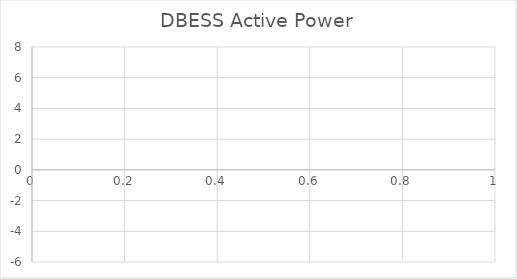
| Category | DBESS Active Power |
|---|---|
| 0 | 0.131 |
| 1 | 0.125 |
| 2 | 0.134 |
| 3 | 0.147 |
| 4 | 0.089 |
| 5 | 0.093 |
| 6 | 0.148 |
| 7 | 0.148 |
| 8 | 0.113 |
| 9 | 0.113 |
| 10 | 0.11 |
| 11 | 0.14 |
| 12 | 0.15 |
| 13 | 0.141 |
| 14 | 0.13 |
| 15 | 0.103 |
| 16 | 0.093 |
| 17 | 0.128 |
| 18 | 0.109 |
| 19 | 0.092 |
| 20 | 0.085 |
| 21 | 0.092 |
| 22 | 0.057 |
| 23 | 0.077 |
| 24 | 0.111 |
| 25 | 0.105 |
| 26 | 0.133 |
| 27 | 0.133 |
| 28 | 0.116 |
| 29 | 0.103 |
| 30 | 0.094 |
| 31 | 0.094 |
| 32 | 0.128 |
| 33 | 0.13 |
| 34 | 0.127 |
| 35 | 0.116 |
| 36 | 0.116 |
| 37 | 0.172 |
| 38 | 0.172 |
| 39 | 0.1 |
| 40 | 0.082 |
| 41 | 0.082 |
| 42 | 0.13 |
| 43 | 0.11 |
| 44 | 0.098 |
| 45 | 0.071 |
| 46 | 0.045 |
| 47 | 0.069 |
| 48 | 0.069 |
| 49 | 0.058 |
| 50 | 0.056 |
| 51 | 0.08 |
| 52 | 0.1 |
| 53 | 0.08 |
| 54 | 0.066 |
| 55 | 0.059 |
| 56 | 0.043 |
| 57 | 0.043 |
| 58 | 0.043 |
| 59 | 0.046 |
| 60 | 0.046 |
| 61 | 0.044 |
| 62 | 0.023 |
| 63 | 0.022 |
| 64 | 0.02 |
| 65 | 0.05 |
| 66 | 0.041 |
| 67 | 0.039 |
| 68 | 0.056 |
| 69 | 0.066 |
| 70 | 0.1 |
| 71 | 0.104 |
| 72 | 0.073 |
| 73 | 0.048 |
| 74 | 0.022 |
| 75 | 0.014 |
| 76 | 0.057 |
| 77 | 0.062 |
| 78 | 0.065 |
| 79 | 0.068 |
| 80 | 0.068 |
| 81 | 0.035 |
| 82 | 0.041 |
| 83 | 0.061 |
| 84 | 0.04 |
| 85 | 0.065 |
| 86 | 0.065 |
| 87 | 0.086 |
| 88 | 0.128 |
| 89 | 0.033 |
| 90 | 0.001 |
| 91 | 0 |
| 92 | 0.011 |
| 93 | 0.045 |
| 94 | 0.036 |
| 95 | 0.01 |
| 96 | 0.01 |
| 97 | -0.009 |
| 98 | -0.006 |
| 99 | 0.027 |
| 100 | 0.028 |
| 101 | 0.048 |
| 102 | 0.03 |
| 103 | -0.011 |
| 104 | 0.033 |
| 105 | 0.041 |
| 106 | 0.011 |
| 107 | 0.02 |
| 108 | 0.035 |
| 109 | 0.014 |
| 110 | 0.002 |
| 111 | -0.007 |
| 112 | 0.004 |
| 113 | 0.014 |
| 114 | 0.022 |
| 115 | 0.022 |
| 116 | 0.047 |
| 117 | 0.039 |
| 118 | 0 |
| 119 | 0.026 |
| 120 | 0.047 |
| 121 | 0.057 |
| 122 | 0.04 |
| 123 | 0.034 |
| 124 | 0.047 |
| 125 | 0.021 |
| 126 | 0.031 |
| 127 | 0.041 |
| 128 | 0.052 |
| 129 | 0.065 |
| 130 | 0.008 |
| 131 | 0.017 |
| 132 | 0.037 |
| 133 | 0.023 |
| 134 | -0.018 |
| 135 | -0.021 |
| 136 | 0.029 |
| 137 | 0.014 |
| 138 | 0.068 |
| 139 | 0.088 |
| 140 | -0.074 |
| 141 | -0.094 |
| 142 | 0.041 |
| 143 | 0.054 |
| 144 | 0.04 |
| 145 | 0.045 |
| 146 | 0.019 |
| 147 | -0.002 |
| 148 | 0.042 |
| 149 | 0.048 |
| 150 | 0.043 |
| 151 | 0.038 |
| 152 | 0.88 |
| 153 | 2.011 |
| 154 | 3.896 |
| 155 | 5.542 |
| 156 | 6.577 |
| 157 | 6.971 |
| 158 | 6.971 |
| 159 | 6.956 |
| 160 | 6.977 |
| 161 | 6.982 |
| 162 | 6.976 |
| 163 | 6.963 |
| 164 | 6.956 |
| 165 | 6.967 |
| 166 | 6.978 |
| 167 | 6.978 |
| 168 | 6.986 |
| 169 | 6.986 |
| 170 | 6.98 |
| 171 | 6.989 |
| 172 | 6.942 |
| 173 | 6.695 |
| 174 | 6.484 |
| 175 | 6.161 |
| 176 | 6.015 |
| 177 | 5.454 |
| 178 | 4.923 |
| 179 | 3.784 |
| 180 | 2.784 |
| 181 | 2.162 |
| 182 | 1.976 |
| 183 | 1.915 |
| 184 | 1.686 |
| 185 | 1.424 |
| 186 | 1.254 |
| 187 | 1.062 |
| 188 | 1.002 |
| 189 | 0.985 |
| 190 | 1.002 |
| 191 | 1 |
| 192 | 0.99 |
| 193 | 0.993 |
| 194 | 0.993 |
| 195 | 1 |
| 196 | 1.003 |
| 197 | 1.003 |
| 198 | 0.924 |
| 199 | 0.716 |
| 200 | 0.48 |
| 201 | 0.203 |
| 202 | 0.09 |
| 203 | 0.13 |
| 204 | 0.303 |
| 205 | 0.543 |
| 206 | 0.802 |
| 207 | 0.967 |
| 208 | 0.907 |
| 209 | 0.716 |
| 210 | 0.408 |
| 211 | 0.2 |
| 212 | 0.057 |
| 213 | 0.064 |
| 214 | 0.077 |
| 215 | 0.077 |
| 216 | 0.038 |
| 217 | 0.038 |
| 218 | 0.1 |
| 219 | 0.258 |
| 220 | 0.555 |
| 221 | 0.784 |
| 222 | 0.979 |
| 223 | 0.885 |
| 224 | 0.812 |
| 225 | 0.465 |
| 226 | 0.232 |
| 227 | 0.045 |
| 228 | 0.01 |
| 229 | 0.034 |
| 230 | 0.05 |
| 231 | 0.004 |
| 232 | -0.035 |
| 233 | 0.105 |
| 234 | 0.266 |
| 235 | 0.514 |
| 236 | 0.807 |
| 237 | 0.952 |
| 238 | 0.925 |
| 239 | 0.88 |
| 240 | 0.402 |
| 241 | 0.208 |
| 242 | 0.044 |
| 243 | 0.026 |
| 244 | 0.224 |
| 245 | 0.522 |
| 246 | 1.023 |
| 247 | 1.588 |
| 248 | 1.863 |
| 249 | 1.788 |
| 250 | 1.479 |
| 251 | 0.853 |
| 252 | 0.273 |
| 253 | 0.088 |
| 254 | 0.024 |
| 255 | 0.024 |
| 256 | 0.042 |
| 257 | 0.057 |
| 258 | 0.059 |
| 259 | 0.042 |
| 260 | 0.032 |
| 261 | 0.014 |
| 262 | 0.039 |
| 263 | 0.046 |
| 264 | -0.013 |
| 265 | -0.015 |
| 266 | 0.046 |
| 267 | 0.047 |
| 268 | 0.025 |
| 269 | 0.011 |
| 270 | 0.014 |
| 271 | 0.014 |
| 272 | -0.007 |
| 273 | 0.01 |
| 274 | 0.254 |
| 275 | 0.576 |
| 276 | 1.122 |
| 277 | 1.645 |
| 278 | 1.898 |
| 279 | 1.787 |
| 280 | 1.633 |
| 281 | 0.953 |
| 282 | 0.396 |
| 283 | 0.064 |
| 284 | 0.019 |
| 285 | 0.015 |
| 286 | 0.014 |
| 287 | 0.018 |
| 288 | 0.019 |
| 289 | 0.002 |
| 290 | -0.005 |
| 291 | 0.001 |
| 292 | 0.017 |
| 293 | 0.018 |
| 294 | 0.015 |
| 295 | 0.017 |
| 296 | 0.016 |
| 297 | 0.032 |
| 298 | 0.015 |
| 299 | 0.018 |
| 300 | 0.027 |
| 301 | -0.012 |
| 302 | 0.035 |
| 303 | 0.062 |
| 304 | 0.042 |
| 305 | 0.222 |
| 306 | 0.518 |
| 307 | 1.113 |
| 308 | 1.594 |
| 309 | 1.852 |
| 310 | 1.779 |
| 311 | 1.523 |
| 312 | 0.875 |
| 313 | 0.165 |
| 314 | 0.081 |
| 315 | 0.002 |
| 316 | 0.021 |
| 317 | 0.042 |
| 318 | 0.015 |
| 319 | 0.024 |
| 320 | -0.039 |
| 321 | 0.001 |
| 322 | -0.011 |
| 323 | 0.001 |
| 324 | 0.001 |
| 325 | 0.016 |
| 326 | 0.008 |
| 327 | 0.008 |
| 328 | 0.028 |
| 329 | 0.028 |
| 330 | 0.014 |
| 331 | 0.01 |
| 332 | 0.009 |
| 333 | 0.013 |
| 334 | 0.013 |
| 335 | 0.005 |
| 336 | 0.019 |
| 337 | -0.002 |
| 338 | -0.008 |
| 339 | -0.012 |
| 340 | -0.001 |
| 341 | 0.036 |
| 342 | 0.011 |
| 343 | -0.007 |
| 344 | 0.008 |
| 345 | 0.02 |
| 346 | 0.011 |
| 347 | 0.021 |
| 348 | 0.037 |
| 349 | 0.001 |
| 350 | 0.001 |
| 351 | 0.019 |
| 352 | 0.05 |
| 353 | 0.017 |
| 354 | -0.017 |
| 355 | 0.018 |
| 356 | 0.036 |
| 357 | 0.036 |
| 358 | 0.016 |
| 359 | 0.029 |
| 360 | 0.034 |
| 361 | 0.025 |
| 362 | 0.02 |
| 363 | 0.01 |
| 364 | 0.037 |
| 365 | 0.038 |
| 366 | 0.037 |
| 367 | 0.037 |
| 368 | 0.056 |
| 369 | 0.032 |
| 370 | 0.032 |
| 371 | -0.006 |
| 372 | 0.019 |
| 373 | 0.037 |
| 374 | 0.038 |
| 375 | 0.022 |
| 376 | 0.011 |
| 377 | 0.019 |
| 378 | 0.02 |
| 379 | 0.041 |
| 380 | 0.01 |
| 381 | 0.127 |
| 382 | 0.122 |
| 383 | 0.014 |
| 384 | 0.014 |
| 385 | 0.018 |
| 386 | 0.018 |
| 387 | 0.04 |
| 388 | 0.04 |
| 389 | -0.006 |
| 390 | -0.006 |
| 391 | 0.033 |
| 392 | 0.033 |
| 393 | 0.017 |
| 394 | 0.017 |
| 395 | 0.038 |
| 396 | 0.01 |
| 397 | -0.025 |
| 398 | 0.021 |
| 399 | 0.028 |
| 400 | 0.028 |
| 401 | -0.007 |
| 402 | -0.001 |
| 403 | -0.001 |
| 404 | 0.032 |
| 405 | 0.028 |
| 406 | 0.005 |
| 407 | 0.044 |
| 408 | 0.021 |
| 409 | 0.028 |
| 410 | 0.001 |
| 411 | -0.013 |
| 412 | 0.031 |
| 413 | 0.031 |
| 414 | 0.044 |
| 415 | 0.036 |
| 416 | 0.018 |
| 417 | 0.032 |
| 418 | 0.021 |
| 419 | 0.021 |
| 420 | 0.03 |
| 421 | 0.055 |
| 422 | 0.038 |
| 423 | 0.059 |
| 424 | 0.02 |
| 425 | 0.02 |
| 426 | 0.011 |
| 427 | 0.02 |
| 428 | 0.024 |
| 429 | -0.008 |
| 430 | -0.004 |
| 431 | 0.045 |
| 432 | 0.045 |
| 433 | 0.053 |
| 434 | 0.045 |
| 435 | 0.035 |
| 436 | 0.025 |
| 437 | 0.028 |
| 438 | 0.004 |
| 439 | -0.001 |
| 440 | 0.014 |
| 441 | 0.014 |
| 442 | -0.015 |
| 443 | -0.008 |
| 444 | 0.023 |
| 445 | 0.053 |
| 446 | 0.069 |
| 447 | 0.06 |
| 448 | 0.049 |
| 449 | 0.066 |
| 450 | 0.066 |
| 451 | 0.12 |
| 452 | 0.12 |
| 453 | 0.143 |
| 454 | 0.124 |
| 455 | 0.13 |
| 456 | 0.149 |
| 457 | 0.115 |
| 458 | 0.136 |
| 459 | 0.141 |
| 460 | 0.102 |
| 461 | 0.102 |
| 462 | 0.089 |
| 463 | 0.079 |
| 464 | 0.065 |
| 465 | 0.08 |
| 466 | 0.107 |
| 467 | 0.111 |
| 468 | 0.121 |
| 469 | 0.121 |
| 470 | 0.102 |
| 471 | 0.114 |
| 472 | 0.123 |
| 473 | 0.125 |
| 474 | 0.125 |
| 475 | 0.132 |
| 476 | 0.167 |
| 477 | 0.154 |
| 478 | 0.117 |
| 479 | 0.135 |
| 480 | 0.119 |
| 481 | 0.123 |
| 482 | 0.101 |
| 483 | 0.107 |
| 484 | 0.129 |
| 485 | 0.135 |
| 486 | 0.139 |
| 487 | 0.139 |
| 488 | 0.135 |
| 489 | 0.123 |
| 490 | 0.142 |
| 491 | 0.142 |
| 492 | 0.123 |
| 493 | 0.12 |
| 494 | 0.137 |
| 495 | 0.161 |
| 496 | 0.147 |
| 497 | 0.147 |
| 498 | 0.147 |
| 499 | 0.144 |
| 500 | -1.536 |
| 501 | -1.55 |
| 502 | -3.137 |
| 503 | -3.273 |
| 504 | -3.368 |
| 505 | -3.41 |
| 506 | -3.35 |
| 507 | -3.356 |
| 508 | -3.278 |
| 509 | -3.184 |
| 510 | -3.014 |
| 511 | -3.059 |
| 512 | -3.071 |
| 513 | -3.054 |
| 514 | -3.018 |
| 515 | -3.091 |
| 516 | -3.175 |
| 517 | -3.325 |
| 518 | -3.442 |
| 519 | -3.461 |
| 520 | -3.443 |
| 521 | -3.409 |
| 522 | -3.299 |
| 523 | -3.515 |
| 524 | -3.488 |
| 525 | -3.405 |
| 526 | -3.429 |
| 527 | -3.45 |
| 528 | -3.448 |
| 529 | -3.395 |
| 530 | -3.395 |
| 531 | -3.363 |
| 532 | -3.401 |
| 533 | -3.479 |
| 534 | -3.498 |
| 535 | -3.482 |
| 536 | -3.48 |
| 537 | -3.497 |
| 538 | -1.992 |
| 539 | -1.992 |
| 540 | -0.522 |
| 541 | -0.416 |
| 542 | -0.439 |
| 543 | -0.554 |
| 544 | -0.645 |
| 545 | -0.794 |
| 546 | -0.958 |
| 547 | -1.027 |
| 548 | -1.077 |
| 549 | -0.94 |
| 550 | -2.053 |
| 551 | -1.88 |
| 552 | -0.167 |
| 553 | 0.03 |
| 554 | 0.111 |
| 555 | 0.122 |
| 556 | 0.161 |
| 557 | 0.136 |
| 558 | 0.141 |
| 559 | 0.11 |
| 560 | 0.103 |
| 561 | 0.138 |
| 562 | 0.143 |
| 563 | 0.16 |
| 564 | 0.139 |
| 565 | 0.139 |
| 566 | 0.133 |
| 567 | 0.117 |
| 568 | 0.115 |
| 569 | 0.097 |
| 570 | -0.654 |
| 571 | -0.843 |
| 572 | -0.77 |
| 573 | -0.032 |
| 574 | 0.163 |
| 575 | 0.163 |
| 576 | 0.148 |
| 577 | 0.136 |
| 578 | 0.127 |
| 579 | 0.142 |
| 580 | 0.126 |
| 581 | 0.126 |
| 582 | 0.13 |
| 583 | 0.149 |
| 584 | 0.123 |
| 585 | 0.12 |
| 586 | 0.137 |
| 587 | 0.14 |
| 588 | 0.101 |
| 589 | 0.097 |
| 590 | 0.099 |
| 591 | 0.102 |
| 592 | 0.11 |
| 593 | 0.11 |
| 594 | 0.082 |
| 595 | 0.101 |
| 596 | 0.101 |
| 597 | 0.122 |
| 598 | 0.101 |
| 599 | 0.104 |
| 600 | 0.097 |
| 601 | 0.085 |
| 602 | 0.128 |
| 603 | 0.114 |
| 604 | 0.089 |
| 605 | 0.083 |
| 606 | 0.102 |
| 607 | 0.102 |
| 608 | 0.095 |
| 609 | 0.078 |
| 610 | 0.078 |
| 611 | 0.076 |
| 612 | 0.078 |
| 613 | 0.076 |
| 614 | 0.042 |
| 615 | 0.034 |
| 616 | 0.065 |
| 617 | 0.044 |
| 618 | 0.018 |
| 619 | 0.043 |
| 620 | 0.075 |
| 621 | 0.082 |
| 622 | 0.045 |
| 623 | 0.028 |
| 624 | 0.069 |
| 625 | 0.082 |
| 626 | 0.082 |
| 627 | 0.039 |
| 628 | 0.024 |
| 629 | 0.064 |
| 630 | 0.064 |
| 631 | 0.042 |
| 632 | 0.098 |
| 633 | 0.067 |
| 634 | 0.076 |
| 635 | 0.08 |
| 636 | 0.035 |
| 637 | 0.042 |
| 638 | 0.064 |
| 639 | 0.061 |
| 640 | 0.074 |
| 641 | 0.068 |
| 642 | 0.043 |
| 643 | 0.015 |
| 644 | 0.024 |
| 645 | 0.035 |
| 646 | 0.072 |
| 647 | 0.071 |
| 648 | 0.032 |
| 649 | 0.049 |
| 650 | 0.046 |
| 651 | 0.009 |
| 652 | 0.027 |
| 653 | 0.078 |
| 654 | 0.071 |
| 655 | 0.049 |
| 656 | 0.046 |
| 657 | 0.048 |
| 658 | 0.055 |
| 659 | 0.017 |
| 660 | 0.061 |
| 661 | 0.087 |
| 662 | 0.063 |
| 663 | 0.061 |
| 664 | 0.052 |
| 665 | 0 |
| 666 | 0.033 |
| 667 | 0.062 |
| 668 | 0.062 |
| 669 | 0.048 |
| 670 | 0.048 |
| 671 | 0.626 |
| 672 | 1.352 |
| 673 | 2.835 |
| 674 | 3.945 |
| 675 | 4.666 |
| 676 | 4.961 |
| 677 | 4.963 |
| 678 | 4.979 |
| 679 | 4.914 |
| 680 | 4.918 |
| 681 | 4.963 |
| 682 | 4.968 |
| 683 | 4.959 |
| 684 | 4.94 |
| 685 | 4.94 |
| 686 | 4.965 |
| 687 | 4.952 |
| 688 | 4.958 |
| 689 | 4.958 |
| 690 | 4.952 |
| 691 | 4.941 |
| 692 | 4.942 |
| 693 | 4.942 |
| 694 | 4.936 |
| 695 | 4.964 |
| 696 | 4.964 |
| 697 | 4.959 |
| 698 | 4.964 |
| 699 | 4.969 |
| 700 | 4.952 |
| 701 | 4.962 |
| 702 | 4.962 |
| 703 | 4.971 |
| 704 | 4.971 |
| 705 | 4.966 |
| 706 | 4.966 |
| 707 | 4.955 |
| 708 | 4.959 |
| 709 | 4.957 |
| 710 | 4.924 |
| 711 | 4.973 |
| 712 | 4.98 |
| 713 | 4.969 |
| 714 | 4.953 |
| 715 | 4.946 |
| 716 | 4.941 |
| 717 | 4.972 |
| 718 | 4.988 |
| 719 | 4.942 |
| 720 | 4.951 |
| 721 | 4.973 |
| 722 | 4.977 |
| 723 | 4.976 |
| 724 | 4.971 |
| 725 | 4.94 |
| 726 | 4.531 |
| 727 | 3.875 |
| 728 | 2.761 |
| 729 | 1.763 |
| 730 | 1.188 |
| 731 | 1.034 |
| 732 | 1.023 |
| 733 | 1.004 |
| 734 | 0.989 |
| 735 | 1.013 |
| 736 | 1.034 |
| 737 | 1.027 |
| 738 | 1.011 |
| 739 | 1.023 |
| 740 | 1.013 |
| 741 | 1.001 |
| 742 | 0.988 |
| 743 | 1.032 |
| 744 | 1.029 |
| 745 | 1.007 |
| 746 | 1.016 |
| 747 | 0.909 |
| 748 | 0.753 |
| 749 | 0.426 |
| 750 | 0.177 |
| 751 | 0.061 |
| 752 | 0.096 |
| 753 | 0.251 |
| 754 | 0.576 |
| 755 | 0.828 |
| 756 | 0.994 |
| 757 | 0.92 |
| 758 | 0.749 |
| 759 | 0.473 |
| 760 | 0.219 |
| 761 | 0.056 |
| 762 | 0.049 |
| 763 | 0.048 |
| 764 | 0.048 |
| 765 | 0.042 |
| 766 | 0.042 |
| 767 | 0.001 |
| 768 | 0.001 |
| 769 | 0.017 |
| 770 | 0.061 |
| 771 | 0.044 |
| 772 | 0.044 |
| 773 | 0.025 |
| 774 | 0.025 |
| 775 | 0.041 |
| 776 | 0.035 |
| 777 | 0.142 |
| 778 | 0.241 |
| 779 | 0.547 |
| 780 | 0.836 |
| 781 | 1.034 |
| 782 | 0.928 |
| 783 | 0.828 |
| 784 | 0.459 |
| 785 | 0.186 |
| 786 | 0.052 |
| 787 | 0.038 |
| 788 | 0.034 |
| 789 | 0.112 |
| 790 | 0.122 |
| 791 | 0.131 |
| 792 | 0.123 |
| 793 | 0.048 |
| 794 | 0.051 |
| 795 | 0.057 |
| 796 | 0.051 |
| 797 | 0.042 |
| 798 | 0.009 |
| 799 | 0.046 |
| 800 | 0.035 |
| 801 | 0.023 |
| 802 | 0.023 |
| 803 | 0.027 |
| 804 | 0.06 |
| 805 | 0.119 |
| 806 | 0.121 |
| 807 | 0.116 |
| 808 | 0.123 |
| 809 | 0.109 |
| 810 | 0.14 |
| 811 | 0.114 |
| 812 | 0.062 |
| 813 | 0.007 |
| 814 | 0.298 |
| 815 | 0.021 |
| 816 | 0.021 |
| 817 | -0.023 |
| 818 | 0.01 |
| 819 | 0.049 |
| 820 | 0.037 |
| 821 | 0.097 |
| 822 | 1.204 |
| 823 | 1.19 |
| 824 | 0.725 |
| 825 | 0.043 |
| 826 | 0.038 |
| 827 | 0.057 |
| 828 | 0.051 |
| 829 | 0.047 |
| 830 | 0.048 |
| 831 | 0.048 |
| 832 | 0.018 |
| 833 | 0.007 |
| 834 | 0.037 |
| 835 | 0.041 |
| 836 | 0.019 |
| 837 | 0.024 |
| 838 | 0.04 |
| 839 | 0.057 |
| 840 | 0.059 |
| 841 | 0.026 |
| 842 | 0.026 |
| 843 | 0.025 |
| 844 | 0.023 |
| 845 | 0.007 |
| 846 | 0.002 |
| 847 | 0.016 |
| 848 | 0.065 |
| 849 | 0.072 |
| 850 | 0.027 |
| 851 | -0.008 |
| 852 | 0.015 |
| 853 | 0.015 |
| 854 | 0.015 |
| 855 | 0.022 |
| 856 | 0.034 |
| 857 | 0.041 |
| 858 | 0.053 |
| 859 | 0.038 |
| 860 | 0.039 |
| 861 | 0.005 |
| 862 | 0.047 |
| 863 | 0.05 |
| 864 | 0.019 |
| 865 | 0.023 |
| 866 | 0.009 |
| 867 | 0.009 |
| 868 | 0.035 |
| 869 | -0.035 |
| 870 | -0.048 |
| 871 | 0.062 |
| 872 | 0.08 |
| 873 | -0.006 |
| 874 | -0.006 |
| 875 | 0.064 |
| 876 | 0.044 |
| 877 | 0.022 |
| 878 | 0.042 |
| 879 | 0.056 |
| 880 | 0.035 |
| 881 | 0.03 |
| 882 | 0.029 |
| 883 | 0.059 |
| 884 | 0.05 |
| 885 | 0.022 |
| 886 | 0.012 |
| 887 | 0.009 |
| 888 | 0.03 |
| 889 | 0.03 |
| 890 | 0.019 |
| 891 | 0.024 |
| 892 | 0.024 |
| 893 | 0.027 |
| 894 | 0.012 |
| 895 | 0.033 |
| 896 | 0.006 |
| 897 | -0.018 |
| 898 | 0.03 |
| 899 | 0.023 |
| 900 | 0.053 |
| 901 | 0.044 |
| 902 | 0.03 |
| 903 | 0.04 |
| 904 | 0.05 |
| 905 | 0.032 |
| 906 | 0.037 |
| 907 | 0.054 |
| 908 | 0.033 |
| 909 | 0.028 |
| 910 | 0.038 |
| 911 | 0.063 |
| 912 | 0.063 |
| 913 | 0.052 |
| 914 | 0.016 |
| 915 | 0.019 |
| 916 | 0.062 |
| 917 | 0.055 |
| 918 | 0.055 |
| 919 | 0.049 |
| 920 | 0.046 |
| 921 | 0.06 |
| 922 | 0.058 |
| 923 | 0.046 |
| 924 | 0.036 |
| 925 | 0.026 |
| 926 | 0.023 |
| 927 | 0.074 |
| 928 | 0.061 |
| 929 | 0.051 |
| 930 | 0.035 |
| 931 | 0.061 |
| 932 | 0.057 |
| 933 | 0.06 |
| 934 | 0.06 |
| 935 | 0.034 |
| 936 | 0.029 |
| 937 | 0.036 |
| 938 | 0.043 |
| 939 | 0.012 |
| 940 | -0.004 |
| 941 | 0.022 |
| 942 | 0.01 |
| 943 | 0.039 |
| 944 | 0.034 |
| 945 | 0.03 |
| 946 | 0.058 |
| 947 | 0.049 |
| 948 | 0.037 |
| 949 | 0.018 |
| 950 | 0.053 |
| 951 | 0.056 |
| 952 | 0.035 |
| 953 | 0.035 |
| 954 | 0.024 |
| 955 | 0.024 |
| 956 | 0.034 |
| 957 | 0.037 |
| 958 | 0.037 |
| 959 | 0.049 |
| 960 | 0.04 |
| 961 | 0.04 |
| 962 | 0.025 |
| 963 | 0.085 |
| 964 | 0.085 |
| 965 | 0.029 |
| 966 | 0.034 |
| 967 | 0.034 |
| 968 | 0.034 |
| 969 | 0.034 |
| 970 | 0.015 |
| 971 | 0.04 |
| 972 | 0.034 |
| 973 | 0.034 |
| 974 | 0.014 |
| 975 | 0.014 |
| 976 | 0.014 |
| 977 | 0.048 |
| 978 | 0.054 |
| 979 | 0.005 |
| 980 | 0.051 |
| 981 | 0.061 |
| 982 | 0.055 |
| 983 | 0.046 |
| 984 | 0.057 |
| 985 | 0.059 |
| 986 | 0.057 |
| 987 | 0.036 |
| 988 | 0.048 |
| 989 | 0.064 |
| 990 | 0.048 |
| 991 | -0.252 |
| 992 | -0.247 |
| 993 | 0.05 |
| 994 | 0.047 |
| 995 | 0.042 |
| 996 | 0.042 |
| 997 | 0.059 |
| 998 | 0.043 |
| 999 | 0.027 |
| 1000 | 0.031 |
| 1001 | 0.031 |
| 1002 | 0.027 |
| 1003 | 0.044 |
| 1004 | 0.044 |
| 1005 | 0.039 |
| 1006 | 0.069 |
| 1007 | 0.037 |
| 1008 | 0.035 |
| 1009 | 0.045 |
| 1010 | 0.04 |
| 1011 | 0.021 |
| 1012 | 0.021 |
| 1013 | 0.029 |
| 1014 | 0.036 |
| 1015 | 0.017 |
| 1016 | 0.013 |
| 1017 | 0.024 |
| 1018 | 0.024 |
| 1019 | 0.014 |
| 1020 | 0.031 |
| 1021 | 0.034 |
| 1022 | 0.02 |
| 1023 | 0.057 |
| 1024 | 0.022 |
| 1025 | 0.026 |
| 1026 | 0.045 |
| 1027 | 0.039 |
| 1028 | 0.039 |
| 1029 | 0.043 |
| 1030 | 0.043 |
| 1031 | 0.014 |
| 1032 | 0.014 |
| 1033 | 0.042 |
| 1034 | 0.042 |
| 1035 | 0.062 |
| 1036 | 0.066 |
| 1037 | 0.066 |
| 1038 | 0.057 |
| 1039 | 0.032 |
| 1040 | 0.032 |
| 1041 | -0.006 |
| 1042 | -0.015 |
| 1043 | 0.016 |
| 1044 | 0.055 |
| 1045 | 0.031 |
| 1046 | 0.036 |
| 1047 | 0.028 |
| 1048 | 0.036 |
| 1049 | 0.044 |
| 1050 | 0.039 |
| 1051 | 0.036 |
| 1052 | 0.035 |
| 1053 | 0.047 |
| 1054 | 0.056 |
| 1055 | 0.047 |
| 1056 | 0.038 |
| 1057 | 0.034 |
| 1058 | 0.077 |
| 1059 | 0.077 |
| 1060 | 0.062 |
| 1061 | 0.066 |
| 1062 | 0.064 |
| 1063 | 0.088 |
| 1064 | 0.081 |
| 1065 | 0.081 |
| 1066 | 0.059 |
| 1067 | 0.046 |
| 1068 | 0.048 |
| 1069 | 0.089 |
| 1070 | 0.089 |
| 1071 | 0.085 |
| 1072 | 0.121 |
| 1073 | 0.121 |
| 1074 | 0.095 |
| 1075 | 0.095 |
| 1076 | 0.102 |
| 1077 | 0.122 |
| 1078 | 0.085 |
| 1079 | 0.078 |
| 1080 | 0.118 |
| 1081 | 0.137 |
| 1082 | 0.121 |
| 1083 | 0.121 |
| 1084 | 0.119 |
| 1085 | 0.109 |
| 1086 | 0.119 |
| 1087 | 0.145 |
| 1088 | 0.144 |
| 1089 | 0.118 |
| 1090 | 0.118 |
| 1091 | 0.137 |
| 1092 | 0.112 |
| 1093 | 0.111 |
| 1094 | 0.135 |
| 1095 | 0.161 |
| 1096 | 0.122 |
| 1097 | 0.122 |
| 1098 | 0.122 |
| 1099 | 0.13 |
| 1100 | 0.137 |
| 1101 | 0.138 |
| 1102 | 0.139 |
| 1103 | 0.146 |
| 1104 | 0.113 |
| 1105 | 0.128 |
| 1106 | 0.144 |
| 1107 | 0.138 |
| 1108 | 0.141 |
| 1109 | 0.139 |
| 1110 | 0.115 |
| 1111 | 0.115 |
| 1112 | 0.126 |
| 1113 | 0.215 |
| 1114 | 0.215 |
| 1115 | 0.13 |
| 1116 | 0.13 |
| 1117 | 0.119 |
| 1118 | 0.119 |
| 1119 | 0.133 |
| 1120 | 0.133 |
| 1121 | 0.146 |
| 1122 | 0.142 |
| 1123 | 0.15 |
| 1124 | 0.162 |
| 1125 | 0.162 |
| 1126 | 0.145 |
| 1127 | 0.172 |
| 1128 | 0.185 |
| 1129 | 0.185 |
| 1130 | 0.185 |
| 1131 | 0.166 |
| 1132 | 0.166 |
| 1133 | 0.18 |
| 1134 | 0.154 |
| 1135 | 0.154 |
| 1136 | 0.162 |
| 1137 | 0.157 |
| 1138 | 0.182 |
| 1139 | 0.164 |
| 1140 | 0.141 |
| 1141 | 0.145 |
| 1142 | 0.164 |
| 1143 | 0.177 |
| 1144 | 0.14 |
| 1145 | 0.141 |
| 1146 | 0.162 |
| 1147 | 0.181 |
| 1148 | 0.178 |
| 1149 | 0.157 |
| 1150 | 0.157 |
| 1151 | 0.279 |
| 1152 | 0.279 |
| 1153 | 0.165 |
| 1154 | 0.159 |
| 1155 | 0.159 |
| 1156 | 0.16 |
| 1157 | 0.139 |
| 1158 | 0.138 |
| 1159 | 0.146 |
| 1160 | 0.146 |
| 1161 | 0.152 |
| 1162 | 0.168 |
| 1163 | 0.167 |
| 1164 | 0.169 |
| 1165 | 0.166 |
| 1166 | 0.155 |
| 1167 | 0.157 |
| 1168 | 0.15 |
| 1169 | 0.173 |
| 1170 | 0.17 |
| 1171 | 0.181 |
| 1172 | 0.181 |
| 1173 | 0.18 |
| 1174 | 0.146 |
| 1175 | 0.143 |
| 1176 | 0.147 |
| 1177 | 0.167 |
| 1178 | 0.167 |
| 1179 | 0.157 |
| 1180 | 0.165 |
| 1181 | 0.18 |
| 1182 | 0.172 |
| 1183 | 0.156 |
| 1184 | 0.192 |
| 1185 | 0.192 |
| 1186 | 0.167 |
| 1187 | 0.167 |
| 1188 | 0.173 |
| 1189 | 0.158 |
| 1190 | 0.159 |
| 1191 | 0.154 |
| 1192 | 0.147 |
| 1193 | 0.189 |
| 1194 | 0.173 |
| 1195 | 0.16 |
| 1196 | 0.184 |
| 1197 | 0.184 |
| 1198 | 0.163 |
| 1199 | 0.163 |
| 1200 | 0.159 |
| 1201 | 0.164 |
| 1202 | 0.146 |
| 1203 | 0.146 |
| 1204 | 0.138 |
| 1205 | 0.135 |
| 1206 | 0.16 |
| 1207 | 0.186 |
| 1208 | 0.174 |
| 1209 | 0.174 |
| 1210 | 0.161 |
| 1211 | 0.166 |
| 1212 | 0.184 |
| 1213 | 0.165 |
| 1214 | 0.165 |
| 1215 | 0.141 |
| 1216 | 0.129 |
| 1217 | 0.174 |
| 1218 | 0.186 |
| 1219 | 0.185 |
| 1220 | 0.178 |
| 1221 | 0.126 |
| 1222 | 0.126 |
| 1223 | 0.162 |
| 1224 | 0.167 |
| 1225 | 0.168 |
| 1226 | 0.133 |
| 1227 | 0.14 |
| 1228 | 0.164 |
| 1229 | 0.185 |
| 1230 | 0.193 |
| 1231 | 0.134 |
| 1232 | 0.149 |
| 1233 | 0.151 |
| 1234 | 0.156 |
| 1235 | 0.156 |
| 1236 | 0.149 |
| 1237 | 0.166 |
| 1238 | 0.171 |
| 1239 | 0.166 |
| 1240 | 0.143 |
| 1241 | 0.143 |
| 1242 | 0.139 |
| 1243 | 0.173 |
| 1244 | 0.157 |
| 1245 | 0.153 |
| 1246 | 0.157 |
| 1247 | 0.187 |
| 1248 | 0.19 |
| 1249 | 0.173 |
| 1250 | 0.165 |
| 1251 | 0.177 |
| 1252 | 0.171 |
| 1253 | 0.163 |
| 1254 | 0.158 |
| 1255 | 0.179 |
| 1256 | 0.192 |
| 1257 | 0.156 |
| 1258 | 0.189 |
| 1259 | 0.198 |
| 1260 | 0.154 |
| 1261 | 0.143 |
| 1262 | 0.167 |
| 1263 | 0.158 |
| 1264 | 0.149 |
| 1265 | 0.149 |
| 1266 | 0.147 |
| 1267 | 0.127 |
| 1268 | 0.136 |
| 1269 | 0.179 |
| 1270 | 0.207 |
| 1271 | 0.207 |
| 1272 | 0.133 |
| 1273 | 0.166 |
| 1274 | 0.166 |
| 1275 | 0.178 |
| 1276 | 0.174 |
| 1277 | 0.121 |
| 1278 | 0.153 |
| 1279 | 0.215 |
| 1280 | 0.22 |
| 1281 | 0.204 |
| 1282 | 0.135 |
| 1283 | 0.135 |
| 1284 | 0.138 |
| 1285 | 0.137 |
| 1286 | 0.152 |
| 1287 | 0.144 |
| 1288 | 0.133 |
| 1289 | 0.125 |
| 1290 | 0.128 |
| 1291 | 0.141 |
| 1292 | 0.155 |
| 1293 | 0.155 |
| 1294 | 0.151 |
| 1295 | 0.155 |
| 1296 | 0.145 |
| 1297 | 0.149 |
| 1298 | 0.142 |
| 1299 | 0.148 |
| 1300 | 0.138 |
| 1301 | 0.125 |
| 1302 | 0.136 |
| 1303 | 0.155 |
| 1304 | 0.138 |
| 1305 | 0.149 |
| 1306 | 0.157 |
| 1307 | 0.137 |
| 1308 | 0.133 |
| 1309 | 0.155 |
| 1310 | 0.155 |
| 1311 | 0.153 |
| 1312 | -0.269 |
| 1313 | -0.267 |
| 1314 | -0.133 |
| 1315 | 0.165 |
| 1316 | 0.165 |
| 1317 | 0.146 |
| 1318 | 0.147 |
| 1319 | 0.151 |
| 1320 | 0.143 |
| 1321 | 0.158 |
| 1322 | 0.169 |
| 1323 | 0.167 |
| 1324 | 0.187 |
| 1325 | 0.181 |
| 1326 | 0.142 |
| 1327 | 0.141 |
| 1328 | 0.157 |
| 1329 | 0.165 |
| 1330 | 0.166 |
| 1331 | 0.171 |
| 1332 | 0.178 |
| 1333 | 0.185 |
| 1334 | 0.146 |
| 1335 | 0.149 |
| 1336 | 0.167 |
| 1337 | 0.164 |
| 1338 | 0.152 |
| 1339 | 0.139 |
| 1340 | 0.146 |
| 1341 | 0.146 |
| 1342 | 0.129 |
| 1343 | 0.116 |
| 1344 | 0.125 |
| 1345 | 0.159 |
| 1346 | 0.16 |
| 1347 | 0.126 |
| 1348 | 0.126 |
| 1349 | 0.135 |
| 1350 | 0.125 |
| 1351 | 0.125 |
| 1352 | 0.127 |
| 1353 | 0.132 |
| 1354 | 0.148 |
| 1355 | 0.148 |
| 1356 | 0.173 |
| 1357 | 0.173 |
| 1358 | 0.159 |
| 1359 | 0.148 |
| 1360 | 0.147 |
| 1361 | 0.147 |
| 1362 | 0.142 |
| 1363 | 0.142 |
| 1364 | 0.128 |
| 1365 | 0.15 |
| 1366 | 0.136 |
| 1367 | 0.13 |
| 1368 | 0.131 |
| 1369 | 0.133 |
| 1370 | 0.158 |
| 1371 | 0.158 |
| 1372 | 0.137 |
| 1373 | 0.147 |
| 1374 | 0.126 |
| 1375 | 0.108 |
| 1376 | 0.123 |
| 1377 | 0.156 |
| 1378 | 0.156 |
| 1379 | 0.134 |
| 1380 | 0.135 |
| 1381 | 0.159 |
| 1382 | 0.141 |
| 1383 | 0.137 |
| 1384 | 0.126 |
| 1385 | 0.112 |
| 1386 | 0.127 |
| 1387 | 0.139 |
| 1388 | 0.131 |
| 1389 | 0.104 |
| 1390 | 0.095 |
| 1391 | 0.122 |
| 1392 | 0.123 |
| 1393 | 0.105 |
| 1394 | 0.111 |
| 1395 | 0.111 |
| 1396 | 0.143 |
| 1397 | 0.125 |
| 1398 | 0.121 |
| 1399 | 0.126 |
| 1400 | 0.094 |
| 1401 | 0.095 |
| 1402 | 0.118 |
| 1403 | 0.106 |
| 1404 | 0.115 |
| 1405 | -0.266 |
| 1406 | -0.845 |
| 1407 | -0.829 |
| 1408 | -0.762 |
| 1409 | 0.102 |
| 1410 | 0.113 |
| 1411 | 0.115 |
| 1412 | 0.112 |
| 1413 | 0.112 |
| 1414 | 0.104 |
| 1415 | 0.125 |
| 1416 | 0.137 |
| 1417 | 0.145 |
| 1418 | 0.102 |
| 1419 | 0.102 |
| 1420 | 0.094 |
| 1421 | 0.128 |
| 1422 | 0.157 |
| 1423 | 0.141 |
| 1424 | 0.098 |
| 1425 | 0.098 |
| 1426 | 0.092 |
| 1427 | 0.096 |
| 1428 | 0.114 |
| 1429 | 0.133 |
| 1430 | 0.126 |
| 1431 | 0.096 |
| 1432 | 0.082 |
| 1433 | 0.112 |
| 1434 | 0.164 |
| 1435 | 0.173 |
| 1436 | 0.189 |
| 1437 | 0.334 |
| 1438 | 0.334 |
| 1439 | 0.153 |
| 1440 | 0.153 |
| 1441 | 0.141 |
| 1442 | 0.129 |
| 1443 | 0.131 |
| 1444 | 0.144 |
| 1445 | 0.144 |
| 1446 | 0.153 |
| 1447 | 0.123 |
| 1448 | 0.122 |
| 1449 | 0.136 |
| 1450 | 0.147 |
| 1451 | 0.144 |
| 1452 | 0.144 |
| 1453 | 0.142 |
| 1454 | 0.158 |
| 1455 | 0.158 |
| 1456 | 0.143 |
| 1457 | 0.139 |
| 1458 | 0.104 |
| 1459 | 0.12 |
| 1460 | 0.112 |
| 1461 | 0.122 |
| 1462 | 0.122 |